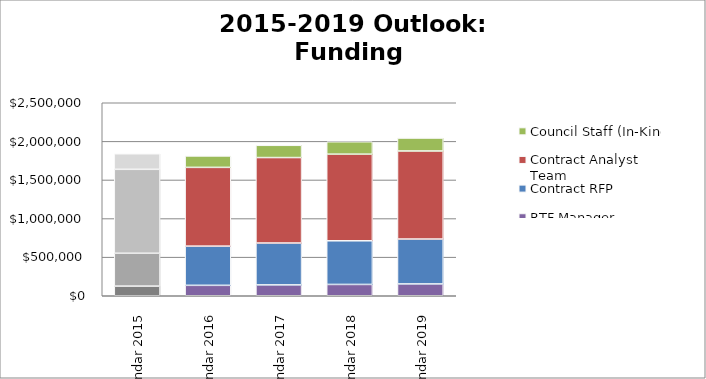
| Category | RTF Manager | Contract RFP | Contract Analyst Team | Council Staff (In-Kind) |
|---|---|---|---|---|
| Calendar 2015 | 125000 | 425600 | 1087000 | 201600 |
| Calendar 2016 | 135000 | 508000 | 1020000 | 148100 |
| Calendar 2017 | 140700 | 542500 | 1106900 | 158600 |
| Calendar 2018 | 146700 | 565400 | 1121900 | 161100 |
| Calendar 2019 | 153400 | 581400 | 1140600 | 167400 |